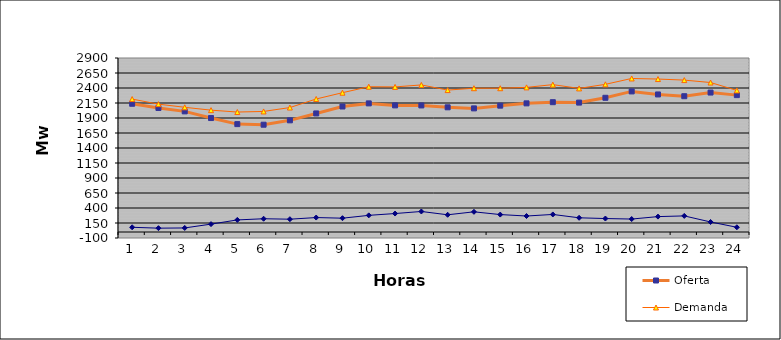
| Category | Oferta | Demanda | No Servida |
|---|---|---|---|
| 1.0 | 2137.05 | 2215.614 | 78.564 |
| 2.0 | 2066.78 | 2130.771 | 63.991 |
| 3.0 | 2010.62 | 2078.324 | 67.704 |
| 4.0 | 1899.44 | 2030.885 | 131.445 |
| 5.0 | 1797.97 | 1999.267 | 201.297 |
| 6.0 | 1788.21 | 2009.24 | 221.03 |
| 7.0 | 1860.99 | 2074.323 | 213.333 |
| 8.0 | 1976.08 | 2216.706 | 240.626 |
| 9.0 | 2091.6 | 2321.692 | 230.092 |
| 10.0 | 2143.55 | 2421.097 | 277.547 |
| 11.0 | 2110.31 | 2418.103 | 307.793 |
| 12.0 | 2109.18 | 2451.226 | 342.046 |
| 13.0 | 2078.08 | 2364.92 | 286.84 |
| 14.0 | 2060.18 | 2396.567 | 336.387 |
| 15.0 | 2105.74 | 2396.338 | 290.598 |
| 16.0 | 2143.94 | 2410.315 | 266.375 |
| 17.0 | 2163.56 | 2456.222 | 292.662 |
| 18.0 | 2156.76 | 2393.327 | 236.567 |
| 19.0 | 2236.74 | 2461.01 | 224.27 |
| 20.0 | 2343.08 | 2558.939 | 215.859 |
| 21.0 | 2292.58 | 2549.105 | 256.525 |
| 22.0 | 2263.26 | 2531.713 | 268.453 |
| 23.0 | 2324.04 | 2491.221 | 167.181 |
| 24.0 | 2281.14 | 2359.842 | 78.702 |